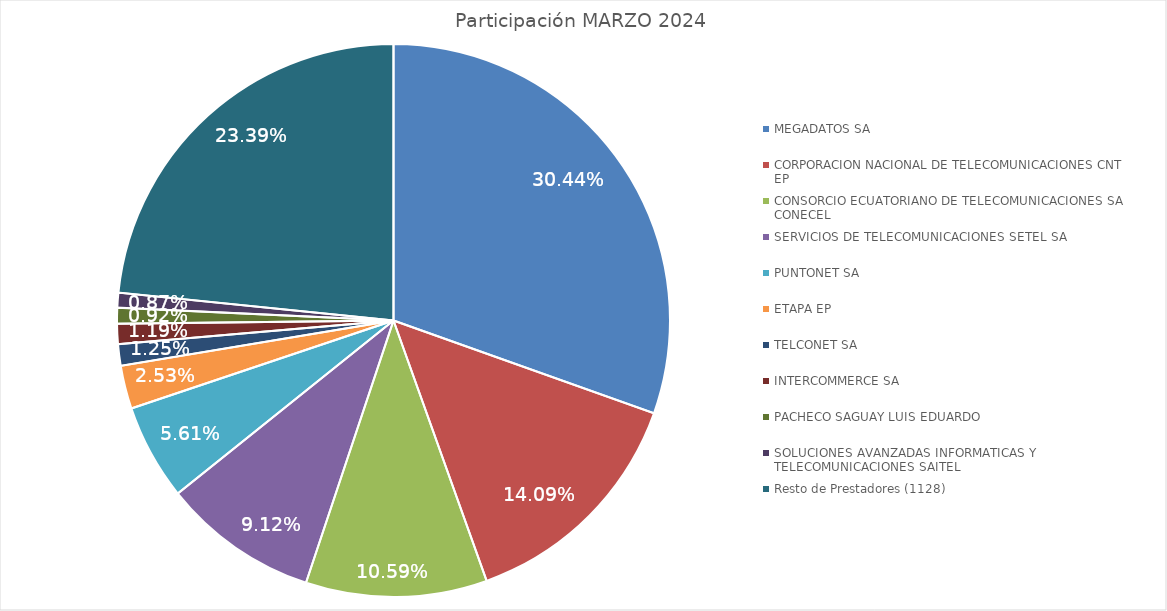
| Category | Series 0 |
|---|---|
| MEGADATOS SA | 897704 |
| CORPORACION NACIONAL DE TELECOMUNICACIONES CNT EP | 415421 |
| CONSORCIO ECUATORIANO DE TELECOMUNICACIONES SA CONECEL | 312393 |
| SERVICIOS DE TELECOMUNICACIONES SETEL SA | 268803 |
| PUNTONET SA | 165371 |
| ETAPA EP | 74511 |
| TELCONET SA | 36976 |
| INTERCOMMERCE SA | 35073 |
| PACHECO SAGUAY LUIS EDUARDO | 27191 |
| SOLUCIONES AVANZADAS INFORMATICAS Y TELECOMUNICACIONES SAITEL | 25543 |
| Resto de Prestadores (1128) | 689794 |